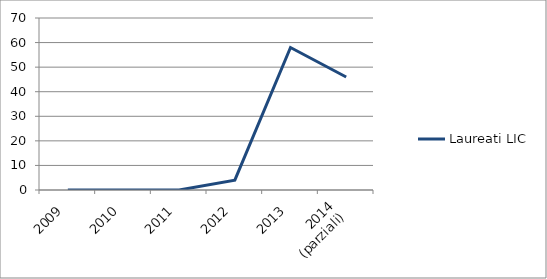
| Category | Laureati LIC |
|---|---|
| 2009 | 0 |
| 2010 | 0 |
| 2011 | 0 |
| 2012 | 4 |
| 2013 | 58 |
| 2014
(parziali) | 46 |